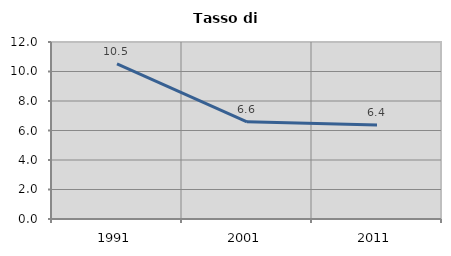
| Category | Tasso di disoccupazione   |
|---|---|
| 1991.0 | 10.513 |
| 2001.0 | 6.585 |
| 2011.0 | 6.366 |